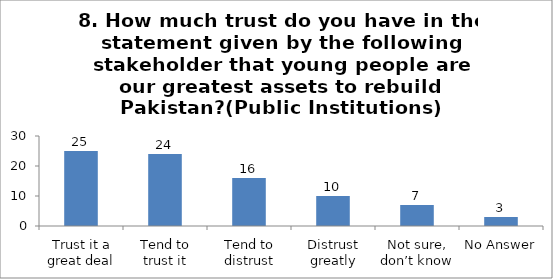
| Category | 8. How much trust do you have in the statement given by the following stakeholder that young people are our greatest assets to rebuild Pakistan?(Public Institutions) |
|---|---|
| Trust it a great deal | 25 |
| Tend to trust it | 24 |
| Tend to distrust | 16 |
| Distrust greatly | 10 |
| Not sure, don’t know | 7 |
| No Answer | 3 |